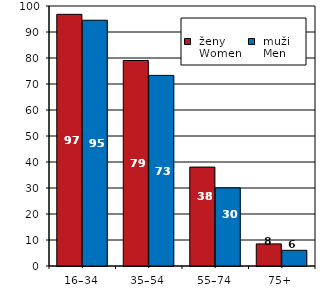
| Category |  ženy 
 Women |  muži 
 Men |
|---|---|---|
| 16–34 | 96.792 | 94.531 |
| 35–54 | 79.034 | 73.306 |
| 55–74 | 38.052 | 30.061 |
| 75+ | 8.499 | 6.038 |